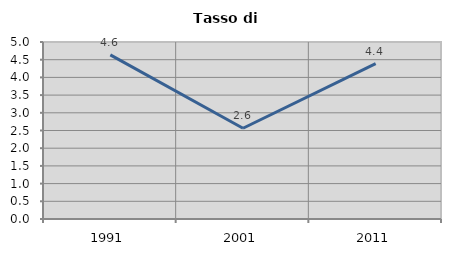
| Category | Tasso di disoccupazione   |
|---|---|
| 1991.0 | 4.637 |
| 2001.0 | 2.564 |
| 2011.0 | 4.39 |